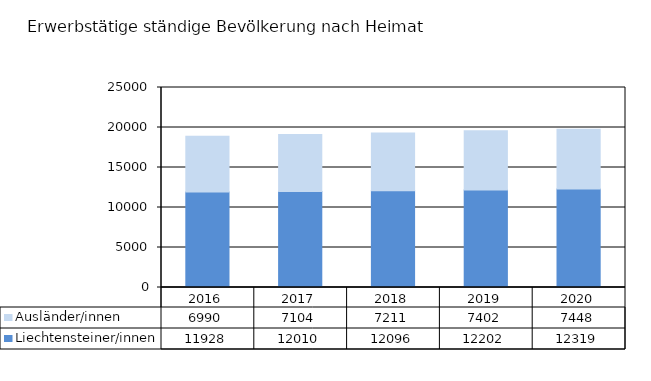
| Category | Liechtensteiner/innen | Ausländer/innen |
|---|---|---|
| 2016.0 | 11928 | 6990 |
| 2017.0 | 12010 | 7104 |
| 2018.0 | 12096 | 7211 |
| 2019.0 | 12202 | 7402 |
| 2020.0 | 12319 | 7448 |